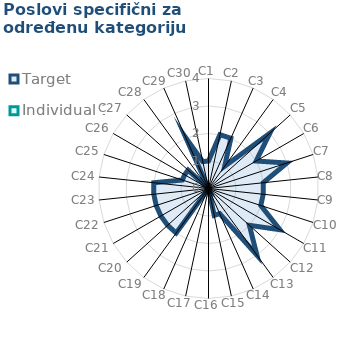
| Category | Target | Individual 1 |
|---|---|---|
| C1 | 1 | 0 |
| C2 | 2 | 0 |
| C3 | 2 | 0 |
| C4 | 1 | 0 |
| C5 | 3 | 0 |
| C6 | 2 | 0 |
| C7 | 3 | 0 |
| C8 | 2 | 0 |
| C9 | 2 | 0 |
| C10 | 2 | 0 |
| C11 | 3 | 0 |
| C12 | 2 | 0 |
| C13 | 3 | 0 |
| C14 | 1 | 0 |
| C15 | 1 | 0 |
| C16 | 0 | 0 |
| C17 | 0 | 0 |
| C18 | 0 | 0 |
| C19 | 2 | 0 |
| C20 | 2 | 0 |
| C21 | 2 | 0 |
| C22 | 2 | 0 |
| C23 | 2 | 0 |
| C24 | 2 | 0 |
| C25 | 1 | 0 |
| C26 | 1 | 0 |
| C27 | 1 | 0 |
| C28 | 0 | 0 |
| C29 | 2 | 0 |
| C30 | 1 | 0 |